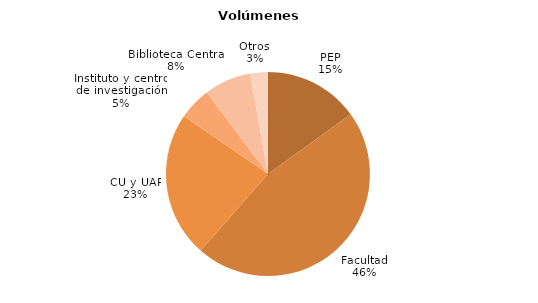
| Category | Series 0 |
|---|---|
| PEP | 143173 |
| Facultad | 441884 |
| CU y UAP | 219651 |
| Instituto y centro de investigación | 49460 |
| Biblioteca Central | 70797 |
| Otros | 26673 |